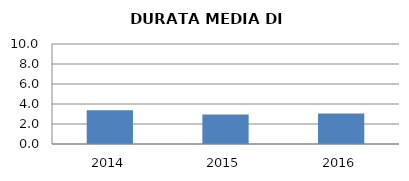
| Category | 2014 2015 2016 |
|---|---|
| 2014.0 | 3.387 |
| 2015.0 | 2.951 |
| 2016.0 | 3.038 |